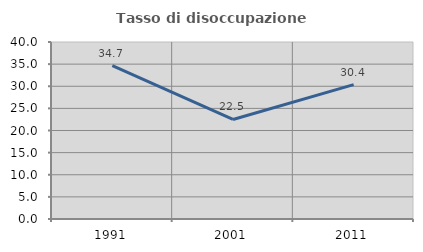
| Category | Tasso di disoccupazione giovanile  |
|---|---|
| 1991.0 | 34.657 |
| 2001.0 | 22.492 |
| 2011.0 | 30.38 |